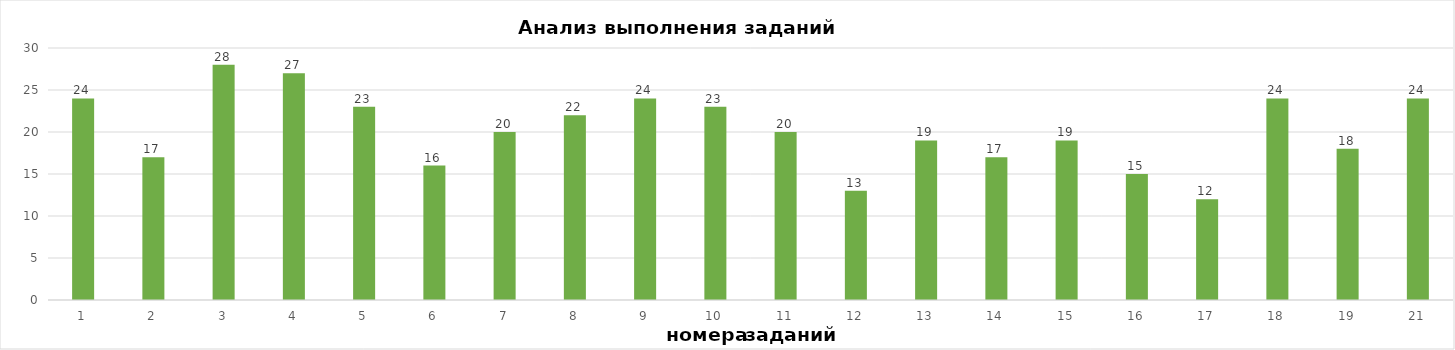
| Category | задания |
|---|---|
| 1.0 | 24 |
| 2.0 | 17 |
| 3.0 | 28 |
| 4.0 | 27 |
| 5.0 | 23 |
| 6.0 | 16 |
| 7.0 | 20 |
| 8.0 | 22 |
| 9.0 | 24 |
| 10.0 | 23 |
| 11.0 | 20 |
| 12.0 | 13 |
| 13.0 | 19 |
| 14.0 | 17 |
| 15.0 | 19 |
| 16.0 | 15 |
| 17.0 | 12 |
| 18.0 | 24 |
| 19.0 | 18 |
| 21.0 | 24 |